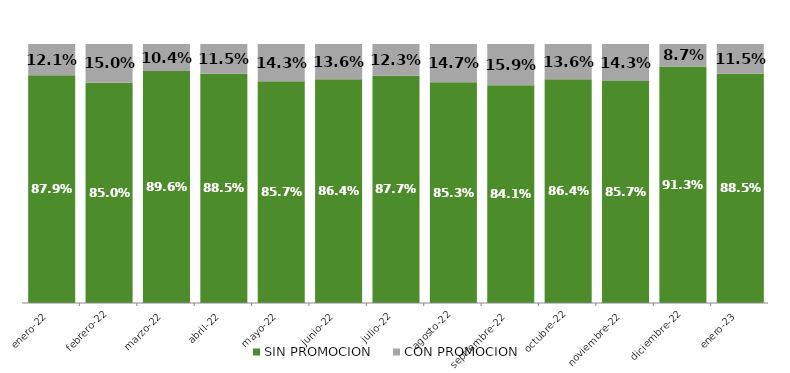
| Category | SIN PROMOCION   | CON PROMOCION   |
|---|---|---|
| 2022-01-01 | 0.879 | 0.121 |
| 2022-02-01 | 0.85 | 0.15 |
| 2022-03-01 | 0.896 | 0.104 |
| 2022-04-01 | 0.885 | 0.115 |
| 2022-05-01 | 0.857 | 0.143 |
| 2022-06-01 | 0.864 | 0.136 |
| 2022-07-01 | 0.877 | 0.123 |
| 2022-08-01 | 0.853 | 0.147 |
| 2022-09-01 | 0.841 | 0.159 |
| 2022-10-01 | 0.864 | 0.136 |
| 2022-11-01 | 0.857 | 0.143 |
| 2022-12-01 | 0.913 | 0.087 |
| 2023-01-01 | 0.885 | 0.115 |